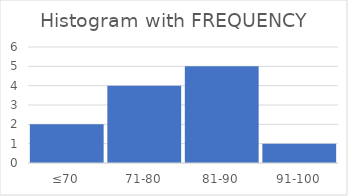
| Category | Count |
|---|---|
| ≤70 | 2 |
| 71-80 | 4 |
| 81-90 | 5 |
| 91-100 | 1 |